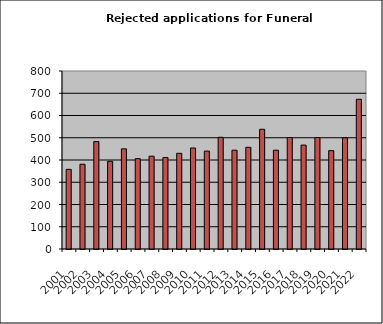
| Category | Series 0 |
|---|---|
| 2001.0 | 358 |
| 2002.0 | 381 |
| 2003.0 | 483 |
| 2004.0 | 394 |
| 2005.0 | 450 |
| 2006.0 | 406 |
| 2007.0 | 417 |
| 2008.0 | 411 |
| 2009.0 | 430 |
| 2010.0 | 454 |
| 2011.0 | 440 |
| 2012.0 | 502 |
| 2013.0 | 444 |
| 2014.0 | 457 |
| 2015.0 | 538 |
| 2016.0 | 444 |
| 2017.0 | 501 |
| 2018.0 | 467 |
| 2019.0 | 501 |
| 2020.0 | 442 |
| 2021.0 | 500 |
| 2022.0 | 673 |